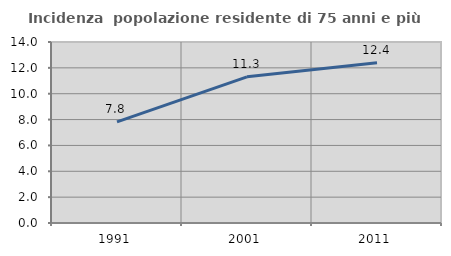
| Category | Incidenza  popolazione residente di 75 anni e più |
|---|---|
| 1991.0 | 7.816 |
| 2001.0 | 11.306 |
| 2011.0 | 12.387 |